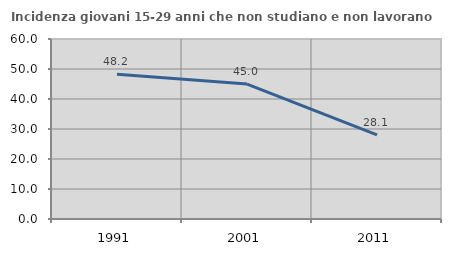
| Category | Incidenza giovani 15-29 anni che non studiano e non lavorano  |
|---|---|
| 1991.0 | 48.249 |
| 2001.0 | 44.966 |
| 2011.0 | 28.07 |